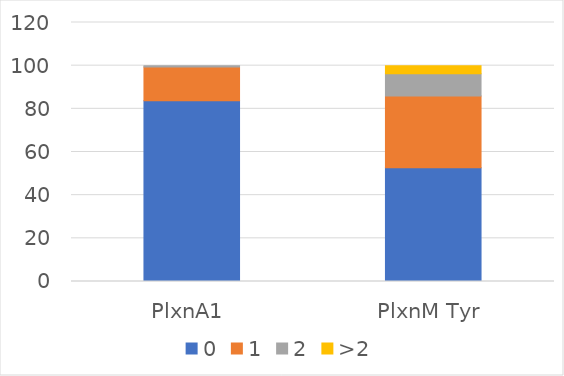
| Category | 0 | 1 | 2 | >2 |
|---|---|---|---|---|
| PlxnA1 | 83.735 | 15.663 | 0.602 | 0 |
| PlxnM Tyr | 52.646 | 33.333 | 10.317 | 3.704 |